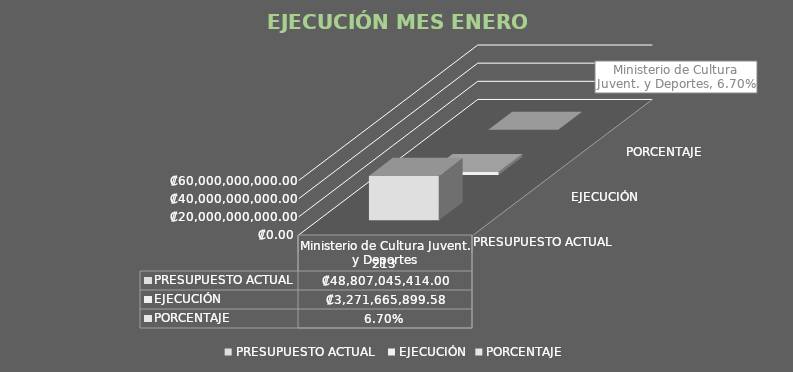
| Category | PRESUPUESTO ACTUAL  | EJECUCIÓN | PORCENTAJE |
|---|---|---|---|
| 0 | 48807045414 | 3271665899.58 | 0.067 |